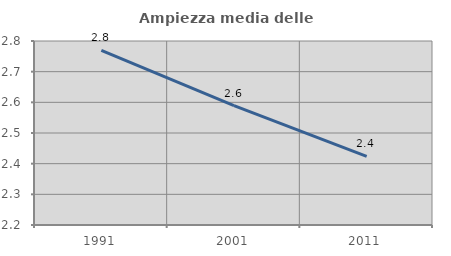
| Category | Ampiezza media delle famiglie |
|---|---|
| 1991.0 | 2.769 |
| 2001.0 | 2.589 |
| 2011.0 | 2.424 |